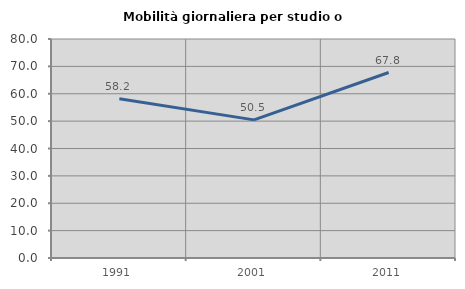
| Category | Mobilità giornaliera per studio o lavoro |
|---|---|
| 1991.0 | 58.187 |
| 2001.0 | 50.459 |
| 2011.0 | 67.761 |